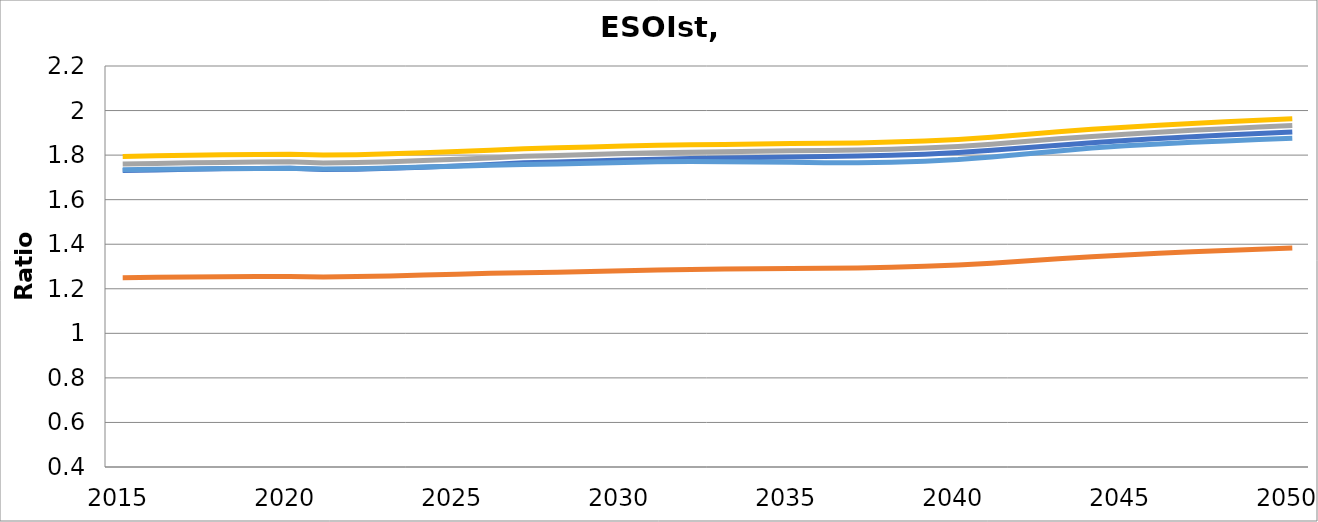
| Category |  ESOIst [LMO] |  ESOIst [NMC622] |  ESOIst [NMC811] |  ESOIst [NCA] |  ESOIst [LFP] |
|---|---|---|---|---|---|
| 2015.0 | 1.25 | 1.731 | 1.76 | 1.794 | 1.734 |
| 2016.0 | 1.252 | 1.734 | 1.763 | 1.797 | 1.736 |
| 2017.0 | 1.253 | 1.736 | 1.765 | 1.8 | 1.738 |
| 2018.0 | 1.254 | 1.738 | 1.767 | 1.802 | 1.74 |
| 2019.0 | 1.255 | 1.74 | 1.769 | 1.803 | 1.74 |
| 2020.0 | 1.255 | 1.741 | 1.77 | 1.804 | 1.741 |
| 2021.0 | 1.253 | 1.735 | 1.765 | 1.8 | 1.738 |
| 2022.0 | 1.255 | 1.737 | 1.767 | 1.802 | 1.739 |
| 2023.0 | 1.258 | 1.741 | 1.771 | 1.806 | 1.742 |
| 2024.0 | 1.261 | 1.746 | 1.775 | 1.81 | 1.746 |
| 2025.0 | 1.266 | 1.752 | 1.781 | 1.816 | 1.751 |
| 2026.0 | 1.27 | 1.757 | 1.787 | 1.822 | 1.755 |
| 2027.0 | 1.272 | 1.765 | 1.795 | 1.829 | 1.757 |
| 2028.0 | 1.275 | 1.769 | 1.799 | 1.833 | 1.76 |
| 2029.0 | 1.277 | 1.774 | 1.802 | 1.836 | 1.763 |
| 2030.0 | 1.281 | 1.778 | 1.807 | 1.841 | 1.767 |
| 2031.0 | 1.285 | 1.782 | 1.81 | 1.844 | 1.77 |
| 2032.0 | 1.287 | 1.784 | 1.813 | 1.846 | 1.771 |
| 2033.0 | 1.288 | 1.787 | 1.815 | 1.848 | 1.77 |
| 2034.0 | 1.29 | 1.789 | 1.817 | 1.85 | 1.769 |
| 2035.0 | 1.291 | 1.792 | 1.819 | 1.852 | 1.767 |
| 2036.0 | 1.292 | 1.793 | 1.821 | 1.853 | 1.766 |
| 2037.0 | 1.293 | 1.796 | 1.823 | 1.855 | 1.766 |
| 2038.0 | 1.296 | 1.8 | 1.827 | 1.858 | 1.768 |
| 2039.0 | 1.301 | 1.804 | 1.832 | 1.863 | 1.773 |
| 2040.0 | 1.306 | 1.811 | 1.839 | 1.87 | 1.78 |
| 2041.0 | 1.315 | 1.821 | 1.849 | 1.881 | 1.791 |
| 2042.0 | 1.325 | 1.833 | 1.861 | 1.893 | 1.805 |
| 2043.0 | 1.335 | 1.845 | 1.873 | 1.904 | 1.819 |
| 2044.0 | 1.344 | 1.856 | 1.884 | 1.916 | 1.832 |
| 2045.0 | 1.352 | 1.866 | 1.894 | 1.926 | 1.842 |
| 2046.0 | 1.359 | 1.874 | 1.903 | 1.934 | 1.85 |
| 2047.0 | 1.366 | 1.883 | 1.911 | 1.942 | 1.857 |
| 2048.0 | 1.372 | 1.89 | 1.919 | 1.95 | 1.864 |
| 2049.0 | 1.377 | 1.897 | 1.926 | 1.957 | 1.87 |
| 2050.0 | 1.383 | 1.904 | 1.932 | 1.963 | 1.876 |